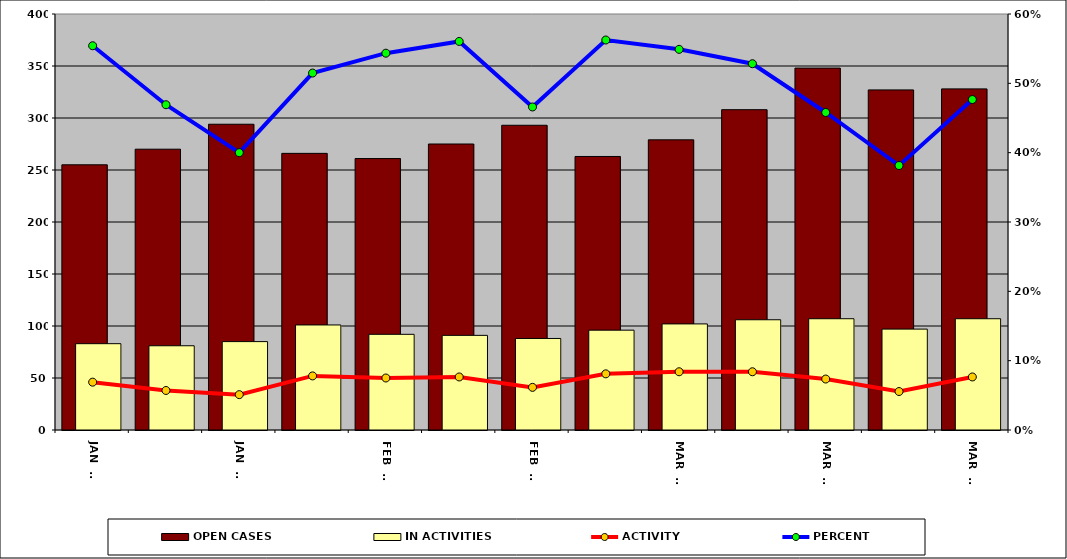
| Category | OPEN CASES | IN ACTIVITIES |
|---|---|---|
| JUN 19 | 255 | 83 |
| JUN 26 | 270 | 81 |
| JUL 03 | 294 | 85 |
| JUL 10 | 266 | 101 |
| JUL 17 | 261 | 92 |
| JUL 24 | 275 | 91 |
| JUL 31 | 293 | 88 |
| AUG 07 | 263 | 96 |
| AUG 14 | 279 | 102 |
| AUG 21 | 308 | 106 |
| AUG 28 | 348 | 107 |
| SEP 04 | 327 | 97 |
| SEP 11 | 328 | 107 |